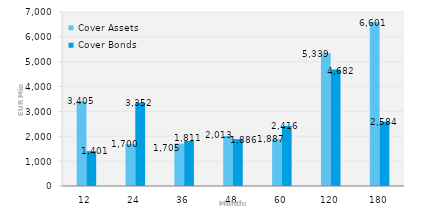
| Category | Cover Assets | Cover Bonds |
|---|---|---|
| 12.0 | 3405.342 | 1400.566 |
| 24.0 | 1699.833 | 3351.793 |
| 36.0 | 1705.418 | 1811.073 |
| 48.0 | 2012.883 | 1885.541 |
| 60.0 | 1887.059 | 2415.545 |
| 120.0 | 5338.724 | 4682.431 |
| 180.0 | 6600.509 | 2584.093 |